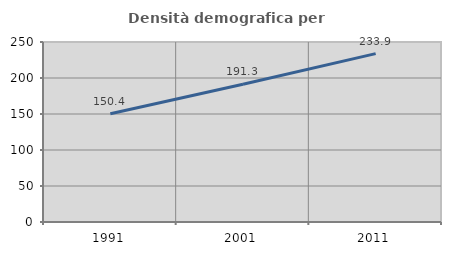
| Category | Densità demografica |
|---|---|
| 1991.0 | 150.374 |
| 2001.0 | 191.281 |
| 2011.0 | 233.884 |